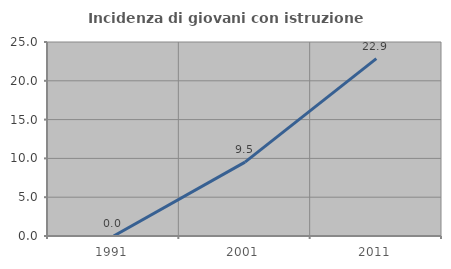
| Category | Incidenza di giovani con istruzione universitaria |
|---|---|
| 1991.0 | 0 |
| 2001.0 | 9.524 |
| 2011.0 | 22.857 |